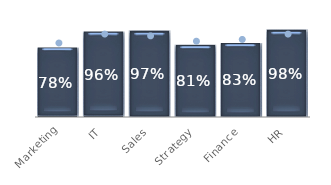
| Category | Series 0 |
|---|---|
| Marketing | 0.78 |
| IT | 0.96 |
| Sales | 0.97 |
| Strategy | 0.81 |
| Finance | 0.83 |
| HR | 0.98 |